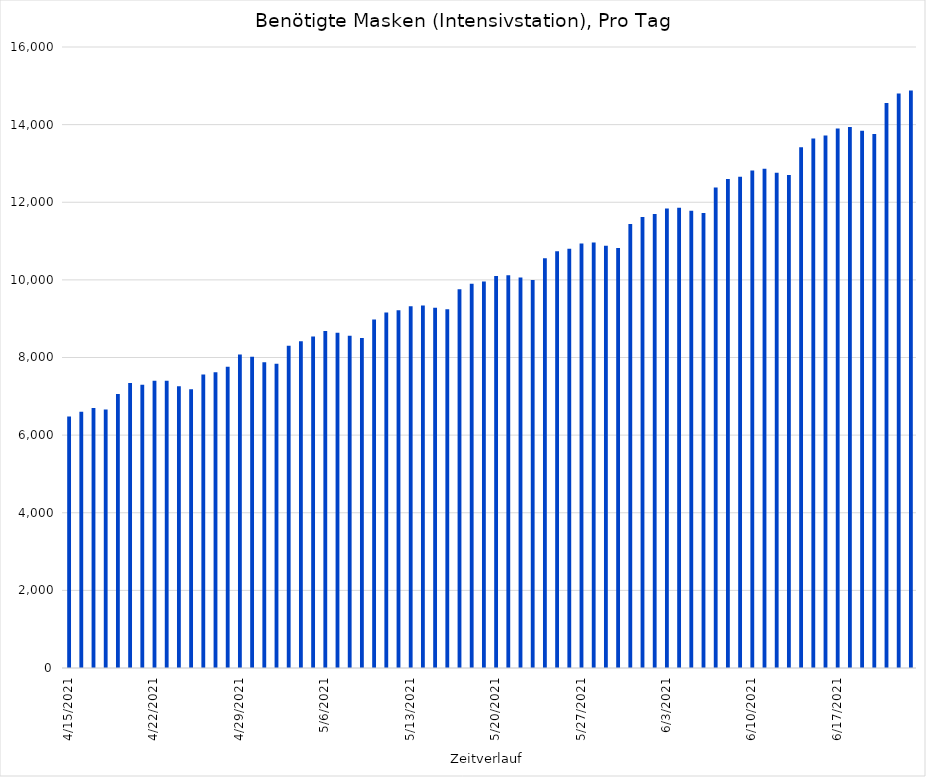
| Category | Pro Tag |
|---|---|
| 4/15/21 | 6480 |
| 4/16/21 | 6600 |
| 4/17/21 | 6700 |
| 4/18/21 | 6660 |
| 4/19/21 | 7060 |
| 4/20/21 | 7340 |
| 4/21/21 | 7300 |
| 4/22/21 | 7400 |
| 4/23/21 | 7400 |
| 4/24/21 | 7260 |
| 4/25/21 | 7180 |
| 4/26/21 | 7560 |
| 4/27/21 | 7620 |
| 4/28/21 | 7760 |
| 4/29/21 | 8080 |
| 4/30/21 | 8020 |
| 5/1/21 | 7880 |
| 5/2/21 | 7840 |
| 5/3/21 | 8300 |
| 5/4/21 | 8420 |
| 5/5/21 | 8540 |
| 5/6/21 | 8680 |
| 5/7/21 | 8640 |
| 5/8/21 | 8560 |
| 5/9/21 | 8500 |
| 5/10/21 | 8980 |
| 5/11/21 | 9160 |
| 5/12/21 | 9220 |
| 5/13/21 | 9320 |
| 5/14/21 | 9340 |
| 5/15/21 | 9280 |
| 5/16/21 | 9240 |
| 5/17/21 | 9760 |
| 5/18/21 | 9900 |
| 5/19/21 | 9960 |
| 5/20/21 | 10100 |
| 5/21/21 | 10120 |
| 5/22/21 | 10060 |
| 5/23/21 | 10000 |
| 5/24/21 | 10560 |
| 5/25/21 | 10740 |
| 5/26/21 | 10800 |
| 5/27/21 | 10940 |
| 5/28/21 | 10960 |
| 5/29/21 | 10880 |
| 5/30/21 | 10820 |
| 5/31/21 | 11440 |
| 6/1/21 | 11620 |
| 6/2/21 | 11700 |
| 6/3/21 | 11840 |
| 6/4/21 | 11860 |
| 6/5/21 | 11780 |
| 6/6/21 | 11720 |
| 6/7/21 | 12380 |
| 6/8/21 | 12600 |
| 6/9/21 | 12660 |
| 6/10/21 | 12820 |
| 6/11/21 | 12860 |
| 6/12/21 | 12760 |
| 6/13/21 | 12700 |
| 6/14/21 | 13420 |
| 6/15/21 | 13640 |
| 6/16/21 | 13720 |
| 6/17/21 | 13900 |
| 6/18/21 | 13940 |
| 6/19/21 | 13840 |
| 6/20/21 | 13760 |
| 6/21/21 | 14560 |
| 6/22/21 | 14800 |
| 6/23/21 | 14880 |